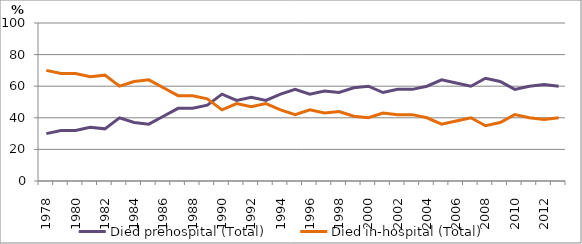
| Category | Died prehospital (Total) | Died in-hospital (Total) |
|---|---|---|
| 1978.0 | 30 | 70 |
| 1979.0 | 32 | 68 |
| 1980.0 | 32 | 68 |
| 1981.0 | 34 | 66 |
| 1982.0 | 33 | 67 |
| 1983.0 | 40 | 60 |
| 1984.0 | 37 | 63 |
| 1985.0 | 36 | 64 |
| 1986.0 | 41 | 59 |
| 1987.0 | 46 | 54 |
| 1988.0 | 46 | 54 |
| 1989.0 | 48 | 52 |
| 1990.0 | 55 | 45 |
| 1991.0 | 51 | 49 |
| 1992.0 | 53 | 47 |
| 1993.0 | 51 | 49 |
| 1994.0 | 55 | 45 |
| 1995.0 | 58 | 42 |
| 1996.0 | 55 | 45 |
| 1997.0 | 57 | 43 |
| 1998.0 | 56 | 44 |
| 1999.0 | 59 | 41 |
| 2000.0 | 60 | 40 |
| 2001.0 | 56 | 43 |
| 2002.0 | 58 | 42 |
| 2003.0 | 58 | 42 |
| 2004.0 | 60 | 40 |
| 2005.0 | 64 | 36 |
| 2006.0 | 62 | 38 |
| 2007.0 | 60 | 40 |
| 2008.0 | 65 | 35 |
| 2009.0 | 63 | 37 |
| 2010.0 | 58 | 42 |
| 2011.0 | 60 | 40 |
| 2012.0 | 61 | 39 |
| 2013.0 | 60 | 40 |